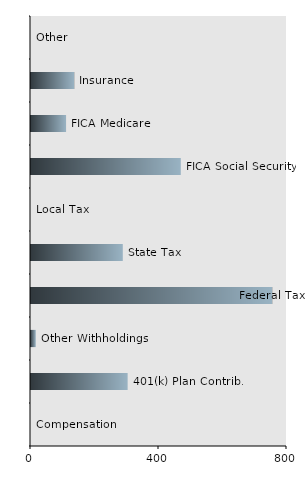
| Category | Series 0 |
|---|---|
| Compensation | 0 |
| 401(k) Plan Contrib. | 302.016 |
| Other Withholdings | 15 |
| Federal Tax | 753.756 |
| State Tax | 286.874 |
| Local Tax  | 0 |
| FICA Social Security | 468.125 |
| FICA Medicare | 109.481 |
| Insurance | 135 |
| Other | 0 |